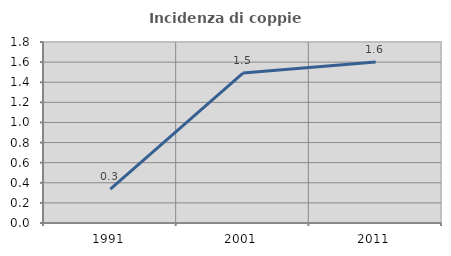
| Category | Incidenza di coppie miste |
|---|---|
| 1991.0 | 0.337 |
| 2001.0 | 1.491 |
| 2011.0 | 1.602 |